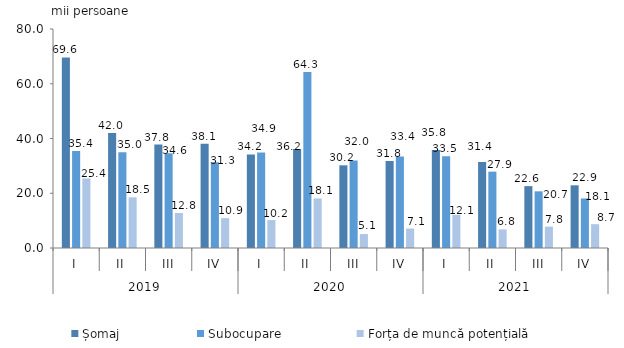
| Category | Șomaj | Subocupare | Forța de muncă potențială |
|---|---|---|---|
| 0 | 69.6 | 35.4 | 25.4 |
| 1 | 42 | 35 | 18.5 |
| 2 | 37.8 | 34.6 | 12.8 |
| 3 | 38.1 | 31.3 | 10.9 |
| 4 | 34.2 | 34.9 | 10.2 |
| 5 | 36.2 | 64.3 | 18.1 |
| 6 | 30.2 | 32 | 5.1 |
| 7 | 31.8 | 33.4 | 7.1 |
| 8 | 35.8 | 33.5 | 12.1 |
| 9 | 31.4 | 27.9 | 6.8 |
| 10 | 22.6 | 20.7 | 7.8 |
| 11 | 22.9 | 18.1 | 8.7 |